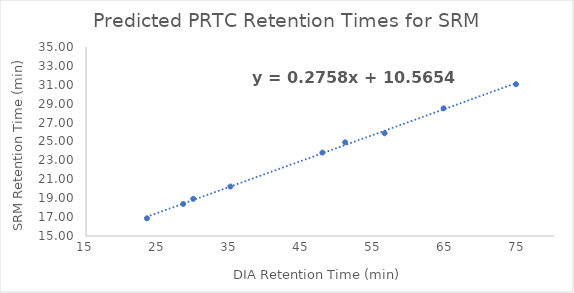
| Category | Series 0 |
|---|---|
| 74.72052631578947 | 31.063 |
| 64.6684210526316 | 28.51 |
| 56.4721052631579 | 25.87 |
| 50.9978947368421 | 24.913 |
| 47.84105263157894 | 23.827 |
| 35.05631578947369 | 20.233 |
| 29.89684210526316 | 18.933 |
| 28.50105263157895 | 18.39 |
| 23.46105263157894 | 16.87 |